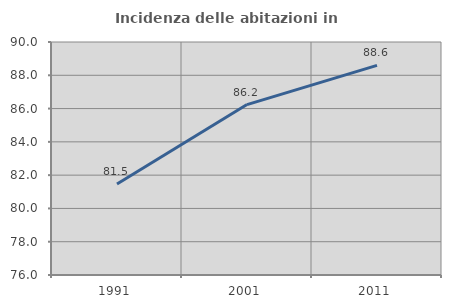
| Category | Incidenza delle abitazioni in proprietà  |
|---|---|
| 1991.0 | 81.466 |
| 2001.0 | 86.24 |
| 2011.0 | 88.594 |